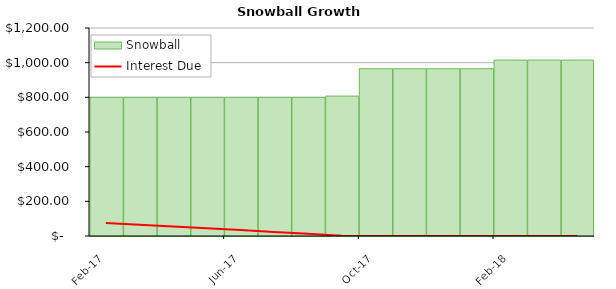
| Category | Snowball |
|---|---|
| 2017-02-01 | 800 |
| 2017-03-01 | 800 |
| 2017-04-01 | 800 |
| 2017-05-01 | 800 |
| 2017-06-01 | 800 |
| 2017-07-01 | 800 |
| 2017-08-01 | 800 |
| 2017-09-01 | 807.2 |
| 2017-10-01 | 965 |
| 2017-11-01 | 965 |
| 2017-12-01 | 965 |
| 2018-01-01 | 965 |
| 2018-02-01 | 1015 |
| 2018-03-01 | 1015 |
| 2018-04-01 | 1015 |
| #N/A | 0 |
| #N/A | 0 |
| #N/A | 0 |
| #N/A | 0 |
| #N/A | 0 |
| #N/A | 0 |
| #N/A | 0 |
| #N/A | 0 |
| #N/A | 0 |
| #N/A | 0 |
| #N/A | 0 |
| #N/A | 0 |
| #N/A | 0 |
| #N/A | 0 |
| #N/A | 0 |
| #N/A | 0 |
| #N/A | 0 |
| #N/A | 0 |
| #N/A | 0 |
| #N/A | 0 |
| #N/A | 0 |
| #N/A | 0 |
| #N/A | 0 |
| #N/A | 0 |
| #N/A | 0 |
| #N/A | 0 |
| #N/A | 0 |
| #N/A | 0 |
| #N/A | 0 |
| #N/A | 0 |
| #N/A | 0 |
| #N/A | 0 |
| #N/A | 0 |
| #N/A | 0 |
| #N/A | 0 |
| #N/A | 0 |
| #N/A | 0 |
| #N/A | 0 |
| #N/A | 0 |
| #N/A | 0 |
| #N/A | 0 |
| #N/A | 0 |
| #N/A | 0 |
| #N/A | 0 |
| #N/A | 0 |
| #N/A | 0 |
| #N/A | 0 |
| #N/A | 0 |
| #N/A | 0 |
| #N/A | 0 |
| #N/A | 0 |
| #N/A | 0 |
| #N/A | 0 |
| #N/A | 0 |
| #N/A | 0 |
| #N/A | 0 |
| #N/A | 0 |
| #N/A | 0 |
| #N/A | 0 |
| #N/A | 0 |
| #N/A | 0 |
| #N/A | 0 |
| #N/A | 0 |
| #N/A | 0 |
| #N/A | 0 |
| #N/A | 0 |
| #N/A | 0 |
| #N/A | 0 |
| #N/A | 0 |
| #N/A | 0 |
| #N/A | 0 |
| #N/A | 0 |
| #N/A | 0 |
| #N/A | 0 |
| #N/A | 0 |
| #N/A | 0 |
| #N/A | 0 |
| #N/A | 0 |
| #N/A | 0 |
| #N/A | 0 |
| #N/A | 0 |
| #N/A | 0 |
| #N/A | 0 |
| #N/A | 0 |
| #N/A | 0 |
| #N/A | 0 |
| #N/A | 0 |
| #N/A | 0 |
| #N/A | 0 |
| #N/A | 0 |
| #N/A | 0 |
| #N/A | 0 |
| #N/A | 0 |
| #N/A | 0 |
| #N/A | 0 |
| #N/A | 0 |
| #N/A | 0 |
| #N/A | 0 |
| #N/A | 0 |
| #N/A | 0 |
| #N/A | 0 |
| #N/A | 0 |
| #N/A | 0 |
| #N/A | 0 |
| #N/A | 0 |
| #N/A | 0 |
| #N/A | 0 |
| #N/A | 0 |
| #N/A | 0 |
| #N/A | 0 |
| #N/A | 0 |
| #N/A | 0 |
| #N/A | 0 |
| #N/A | 0 |
| #N/A | 0 |
| #N/A | 0 |
| #N/A | 0 |
| #N/A | 0 |
| #N/A | 0 |
| #N/A | 0 |
| #N/A | 0 |
| #N/A | 0 |
| #N/A | 0 |
| #N/A | 0 |
| #N/A | 0 |
| #N/A | 0 |
| #N/A | 0 |
| #N/A | 0 |
| #N/A | 0 |
| #N/A | 0 |
| #N/A | 0 |
| #N/A | 0 |
| #N/A | 0 |
| #N/A | 0 |
| #N/A | 0 |
| #N/A | 0 |
| #N/A | 0 |
| #N/A | 0 |
| #N/A | 0 |
| #N/A | 0 |
| #N/A | 0 |
| #N/A | 0 |
| #N/A | 0 |
| #N/A | 0 |
| #N/A | 0 |
| #N/A | 0 |
| #N/A | 0 |
| #N/A | 0 |
| #N/A | 0 |
| #N/A | 0 |
| #N/A | 0 |
| #N/A | 0 |
| #N/A | 0 |
| #N/A | 0 |
| #N/A | 0 |
| #N/A | 0 |
| #N/A | 0 |
| #N/A | 0 |
| #N/A | 0 |
| #N/A | 0 |
| #N/A | 0 |
| #N/A | 0 |
| #N/A | 0 |
| #N/A | 0 |
| #N/A | 0 |
| #N/A | 0 |
| #N/A | 0 |
| #N/A | 0 |
| #N/A | 0 |
| #N/A | 0 |
| #N/A | 0 |
| #N/A | 0 |
| #N/A | 0 |
| #N/A | 0 |
| #N/A | 0 |
| #N/A | 0 |
| #N/A | 0 |
| #N/A | 0 |
| #N/A | 0 |
| #N/A | 0 |
| #N/A | 0 |
| #N/A | 0 |
| #N/A | 0 |
| #N/A | 0 |
| #N/A | 0 |
| #N/A | 0 |
| #N/A | 0 |
| #N/A | 0 |
| #N/A | 0 |
| #N/A | 0 |
| #N/A | 0 |
| #N/A | 0 |
| #N/A | 0 |
| #N/A | 0 |
| #N/A | 0 |
| #N/A | 0 |
| #N/A | 0 |
| #N/A | 0 |
| #N/A | 0 |
| #N/A | 0 |
| #N/A | 0 |
| #N/A | 0 |
| #N/A | 0 |
| #N/A | 0 |
| #N/A | 0 |
| #N/A | 0 |
| #N/A | 0 |
| #N/A | 0 |
| #N/A | 0 |
| #N/A | 0 |
| #N/A | 0 |
| #N/A | 0 |
| #N/A | 0 |
| #N/A | 0 |
| #N/A | 0 |
| #N/A | 0 |
| #N/A | 0 |
| #N/A | 0 |
| #N/A | 0 |
| #N/A | 0 |
| #N/A | 0 |
| #N/A | 0 |
| #N/A | 0 |
| #N/A | 0 |
| #N/A | 0 |
| #N/A | 0 |
| #N/A | 0 |
| #N/A | 0 |
| #N/A | 0 |
| #N/A | 0 |
| #N/A | 0 |
| #N/A | 0 |
| #N/A | 0 |
| #N/A | 0 |
| #N/A | 0 |
| #N/A | 0 |
| #N/A | 0 |
| #N/A | 0 |
| #N/A | 0 |
| #N/A | 0 |
| #N/A | 0 |
| #N/A | 0 |
| #N/A | 0 |
| #N/A | 0 |
| #N/A | 0 |
| #N/A | 0 |
| #N/A | 0 |
| #N/A | 0 |
| #N/A | 0 |
| #N/A | 0 |
| #N/A | 0 |
| #N/A | 0 |
| #N/A | 0 |
| #N/A | 0 |
| #N/A | 0 |
| #N/A | 0 |
| #N/A | 0 |
| #N/A | 0 |
| #N/A | 0 |
| #N/A | 0 |
| #N/A | 0 |
| #N/A | 0 |
| #N/A | 0 |
| #N/A | 0 |
| #N/A | 0 |
| #N/A | 0 |
| #N/A | 0 |
| #N/A | 0 |
| #N/A | 0 |
| #N/A | 0 |
| #N/A | 0 |
| #N/A | 0 |
| #N/A | 0 |
| #N/A | 0 |
| #N/A | 0 |
| #N/A | 0 |
| #N/A | 0 |
| #N/A | 0 |
| #N/A | 0 |
| #N/A | 0 |
| #N/A | 0 |
| #N/A | 0 |
| #N/A | 0 |
| #N/A | 0 |
| #N/A | 0 |
| #N/A | 0 |
| #N/A | 0 |
| #N/A | 0 |
| #N/A | 0 |
| #N/A | 0 |
| #N/A | 0 |
| #N/A | 0 |
| #N/A | 0 |
| #N/A | 0 |
| #N/A | 0 |
| #N/A | 0 |
| #N/A | 0 |
| #N/A | 0 |
| #N/A | 0 |
| #N/A | 0 |
| #N/A | 0 |
| #N/A | 0 |
| #N/A | 0 |
| #N/A | 0 |
| #N/A | 0 |
| #N/A | 0 |
| #N/A | 0 |
| #N/A | 0 |
| #N/A | 0 |
| #N/A | 0 |
| #N/A | 0 |
| #N/A | 0 |
| #N/A | 0 |
| #N/A | 0 |
| #N/A | 0 |
| #N/A | 0 |
| #N/A | 0 |
| #N/A | 0 |
| #N/A | 0 |
| #N/A | 0 |
| #N/A | 0 |
| #N/A | 0 |
| #N/A | 0 |
| #N/A | 0 |
| #N/A | 0 |
| #N/A | 0 |
| #N/A | 0 |
| #N/A | 0 |
| #N/A | 0 |
| #N/A | 0 |
| #N/A | 0 |
| #N/A | 0 |
| #N/A | 0 |
| #N/A | 0 |
| #N/A | 0 |
| #N/A | 0 |
| #N/A | 0 |
| #N/A | 0 |
| #N/A | 0 |
| #N/A | 0 |
| #N/A | 0 |
| #N/A | 0 |
| #N/A | 0 |
| #N/A | 0 |
| #N/A | 0 |